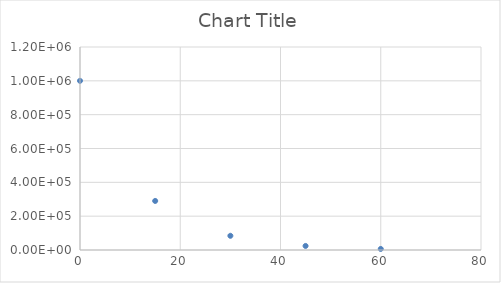
| Category | Series 0 |
|---|---|
| 0.0 | 1000000 |
| 15.0 | 290000 |
| 30.0 | 84000 |
| 45.0 | 24000 |
| 60.0 | 6300 |